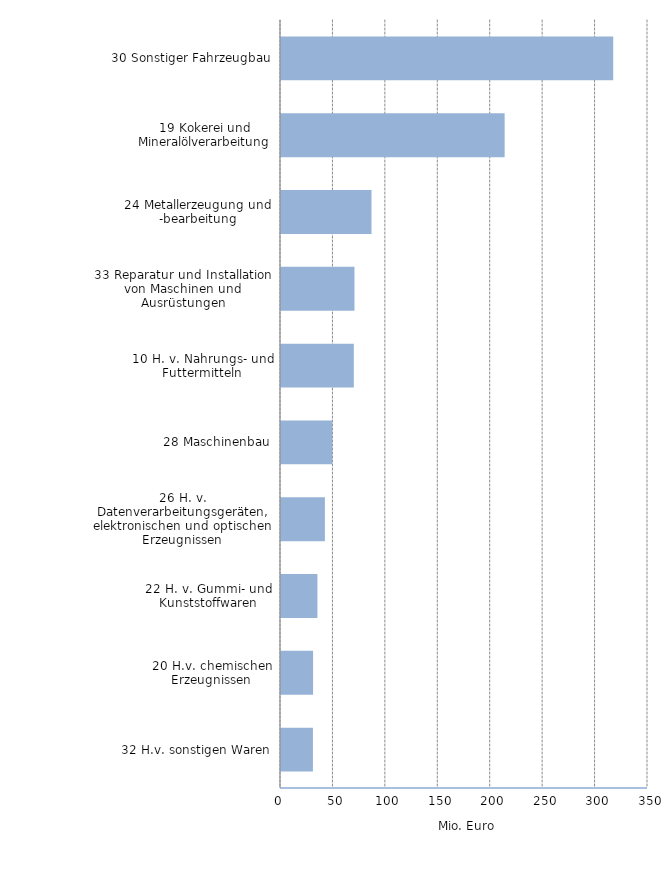
| Category | Mio. Euro |
|---|---|
| 32 H.v. sonstigen Waren | 30.449 |
| 20 H.v. chemischen Erzeugnissen | 30.598 |
| 22 H. v. Gummi- und Kunststoffwaren | 34.735 |
| 26 H. v. Datenverarbeitungsgeräten, elektronischen und optischen Erzeugnissen | 41.878 |
| 28 Maschinenbau | 48.801 |
| 10 H. v. Nahrungs- und Futtermitteln | 69.439 |
| 33 Reparatur und Installation von Maschinen und Ausrüstungen | 70.064 |
| 24 Metallerzeugung und -bearbeitung | 86.304 |
| 19 Kokerei und Mineralölverarbeitung | 213.29 |
| 30 Sonstiger Fahrzeugbau | 316.833 |